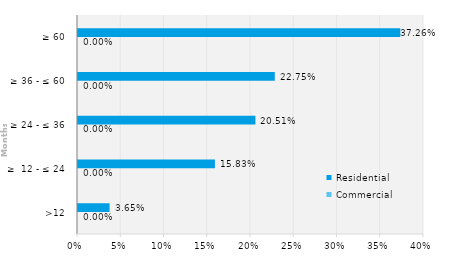
| Category | Commercial | Residential |
|---|---|---|
| >12 | 0 | 0.036 |
| ≥  12 - ≤ 24 | 0 | 0.158 |
| ≥ 24 - ≤ 36 | 0 | 0.205 |
| ≥ 36 - ≤ 60 | 0 | 0.228 |
| ≥ 60 | 0 | 0.373 |